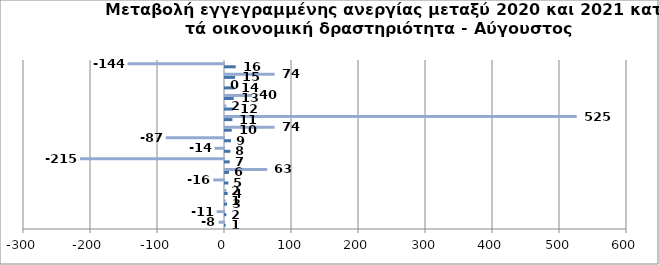
| Category | Series 0 | Series 1 |
|---|---|---|
| 0 | 1 | -8 |
| 1 | 2 | -11 |
| 2 | 3 | 1 |
| 3 | 4 | 2 |
| 4 | 5 | -16 |
| 5 | 6 | 63 |
| 6 | 7 | -215 |
| 7 | 8 | -14 |
| 8 | 9 | -87 |
| 9 | 10 | 74 |
| 10 | 11 | 525 |
| 11 | 12 | 2 |
| 12 | 13 | 40 |
| 13 | 14 | 0 |
| 14 | 15 | 74 |
| 15 | 16 | -144 |